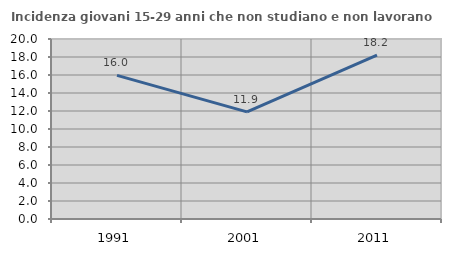
| Category | Incidenza giovani 15-29 anni che non studiano e non lavorano  |
|---|---|
| 1991.0 | 15.962 |
| 2001.0 | 11.901 |
| 2011.0 | 18.211 |